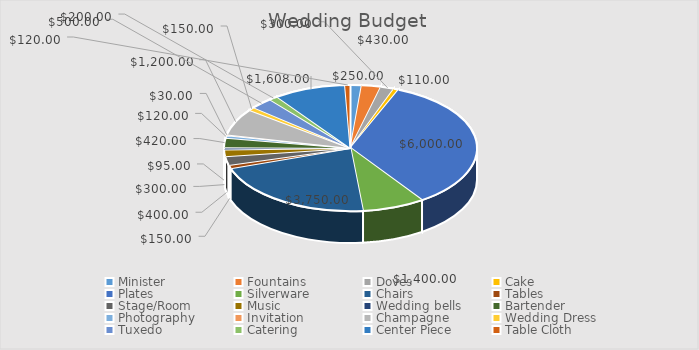
| Category | Total |
|---|---|
| Minister | 250 |
| Fountains | 430 |
| Doves | 300 |
| Cake | 110 |
| Plates | 6000 |
| Silverware | 1400 |
| Chairs | 3750 |
| Tables | 150 |
| Stage/Room | 400 |
| Music  | 300 |
| Wedding bells | 95 |
| Bartender | 420 |
| Photography | 120 |
| Invitation | 30 |
| Champagne | 1200 |
| Wedding Dress | 150 |
| Tuxedo | 500 |
| Catering | 200 |
| Center Piece | 1608 |
| Table Cloth | 120 |